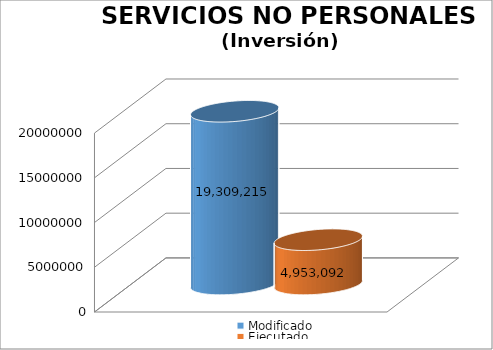
| Category | Modificado | Ejecutado |
|---|---|---|
| 0 | 19309215 | 4953092.11 |